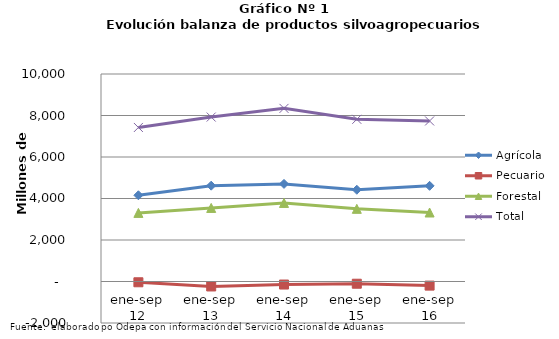
| Category | Agrícola | Pecuario | Forestal | Total |
|---|---|---|---|---|
| ene-sep 12 | 4155428 | -37598 | 3305945 | 7423775 |
| ene-sep 13 | 4617952 | -238773 | 3545669 | 7924848 |
| ene-sep 14 | 4703746 | -146807 | 3786414 | 8343353 |
| ene-sep 15 | 4421791 | -107209 | 3501852 | 7816434 |
| ene-sep 16 | 4609988 | -198587 | 3325266 | 7736667 |